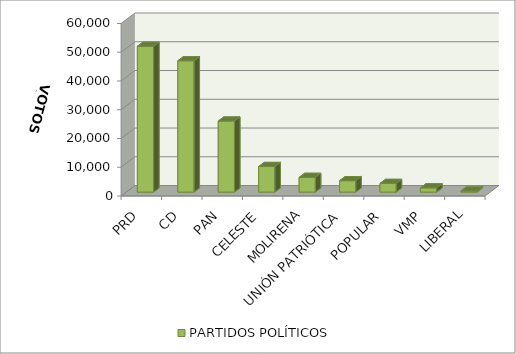
| Category | PARTIDOS POLÍTICOS |
|---|---|
| PRD | 50707 |
| CD | 45662 |
| PAN | 24700 |
| CELESTE | 8888 |
| MOLIRENA | 5111 |
| UNIÓN PATRIÓTICA | 3966 |
| POPULAR | 3001 |
| VMP | 1468 |
| LIBERAL | 352 |